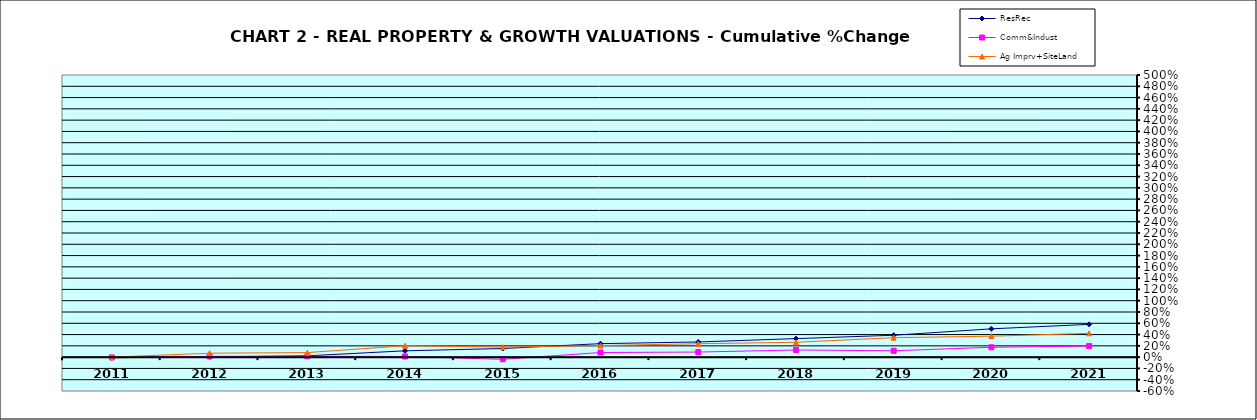
| Category | ResRec | Comm&Indust | Ag Imprv+SiteLand |
|---|---|---|---|
| 2011.0 | -0.011 | -0.005 | 0 |
| 2012.0 | 0.005 | 0.014 | 0.07 |
| 2013.0 | 0.024 | 0.015 | 0.08 |
| 2014.0 | 0.112 | 0.012 | 0.202 |
| 2015.0 | 0.153 | -0.039 | 0.178 |
| 2016.0 | 0.239 | 0.082 | 0.205 |
| 2017.0 | 0.269 | 0.09 | 0.238 |
| 2018.0 | 0.328 | 0.127 | 0.263 |
| 2019.0 | 0.388 | 0.113 | 0.345 |
| 2020.0 | 0.502 | 0.175 | 0.372 |
| 2021.0 | 0.581 | 0.197 | 0.422 |